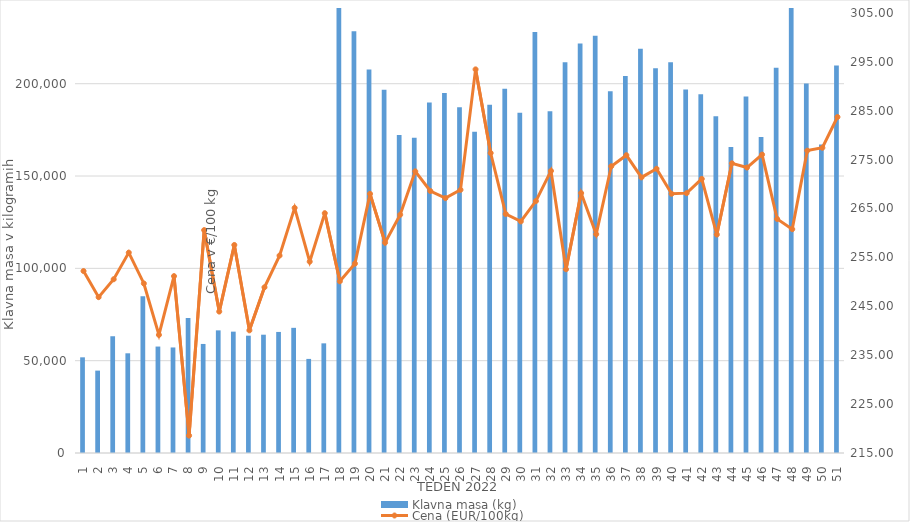
| Category | Klavna masa (kg) |
|---|---|
| 1.0 | 51818 |
| 2.0 | 44619 |
| 3.0 | 63233 |
| 4.0 | 53993 |
| 5.0 | 84871 |
| 6.0 | 57648 |
| 7.0 | 57159 |
| 8.0 | 73139 |
| 9.0 | 59056 |
| 10.0 | 66417 |
| 11.0 | 65723 |
| 12.0 | 63530 |
| 13.0 | 64069 |
| 14.0 | 65564 |
| 15.0 | 67787 |
| 16.0 | 50958 |
| 17.0 | 59387 |
| 18.0 | 241833 |
| 19.0 | 228389 |
| 20.0 | 207661 |
| 21.0 | 196732 |
| 22.0 | 172190 |
| 23.0 | 170751 |
| 24.0 | 189775 |
| 25.0 | 195029 |
| 26.0 | 187239 |
| 27.0 | 173967 |
| 28.0 | 188601 |
| 29.0 | 197293 |
| 30.0 | 184259 |
| 31.0 | 228023 |
| 32.0 | 185079 |
| 33.0 | 211612 |
| 34.0 | 221748 |
| 35.0 | 225927 |
| 36.0 | 195924 |
| 37.0 | 204224 |
| 38.0 | 218966 |
| 39.0 | 208403 |
| 40.0 | 211635 |
| 41.0 | 196841 |
| 42.0 | 194271 |
| 43.0 | 182399 |
| 44.0 | 165696 |
| 45.0 | 193022 |
| 46.0 | 171172 |
| 47.0 | 208597 |
| 48.0 | 253151 |
| 49.0 | 200117 |
| 50.0 | 167119 |
| 51.0 | 209797 |